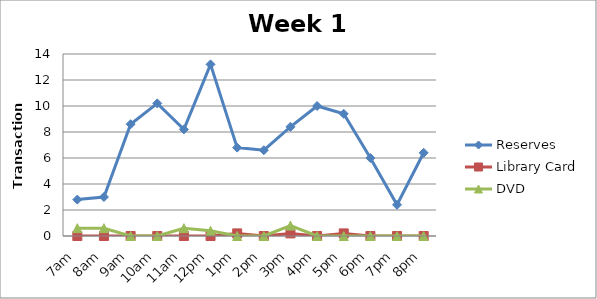
| Category | Reserves | Library Card | DVD |
|---|---|---|---|
| 7am | 2.8 | 0 | 0.6 |
| 8am | 3 | 0 | 0.6 |
| 9am | 8.6 | 0 | 0 |
| 10am | 10.2 | 0 | 0 |
| 11am | 8.2 | 0 | 0.6 |
| 12pm | 13.2 | 0 | 0.4 |
| 1pm | 6.8 | 0.2 | 0 |
| 2pm | 6.6 | 0 | 0 |
| 3pm | 8.4 | 0.2 | 0.8 |
| 4pm | 10 | 0 | 0 |
| 5pm | 9.4 | 0.2 | 0 |
| 6pm | 6 | 0 | 0 |
| 7pm | 2.4 | 0 | 0 |
| 8pm | 6.4 | 0 | 0 |